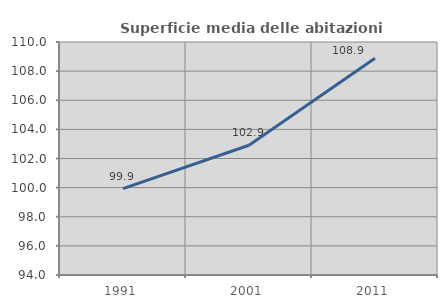
| Category | Superficie media delle abitazioni occupate |
|---|---|
| 1991.0 | 99.932 |
| 2001.0 | 102.913 |
| 2011.0 | 108.879 |